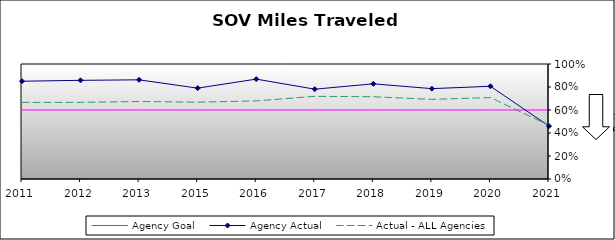
| Category | Agency Goal | Agency Actual | Actual - ALL Agencies |
|---|---|---|---|
| 2011.0 | 0.6 | 0.85 | 0.666 |
| 2012.0 | 0.6 | 0.858 | 0.666 |
| 2013.0 | 0.6 | 0.862 | 0.674 |
| 2015.0 | 0.6 | 0.79 | 0.668 |
| 2016.0 | 0.6 | 0.868 | 0.679 |
| 2017.0 | 0.6 | 0.781 | 0.719 |
| 2018.0 | 0.6 | 0.828 | 0.715 |
| 2019.0 | 0.6 | 0.786 | 0.692 |
| 2020.0 | 0.6 | 0.806 | 0.708 |
| 2021.0 | 0.6 | 0.46 | 0.467 |